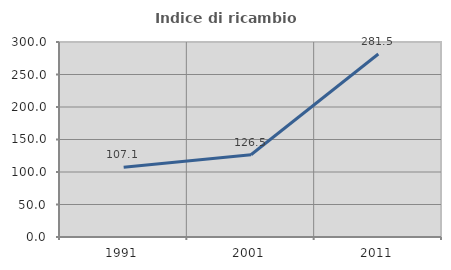
| Category | Indice di ricambio occupazionale  |
|---|---|
| 1991.0 | 107.143 |
| 2001.0 | 126.471 |
| 2011.0 | 281.481 |